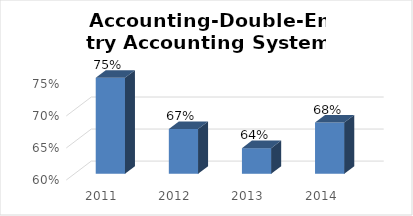
| Category | Series 0 |
|---|---|
| 2011.0 | 0.75 |
| 2012.0 | 0.67 |
| 2013.0 | 0.64 |
| 2014.0 | 0.68 |